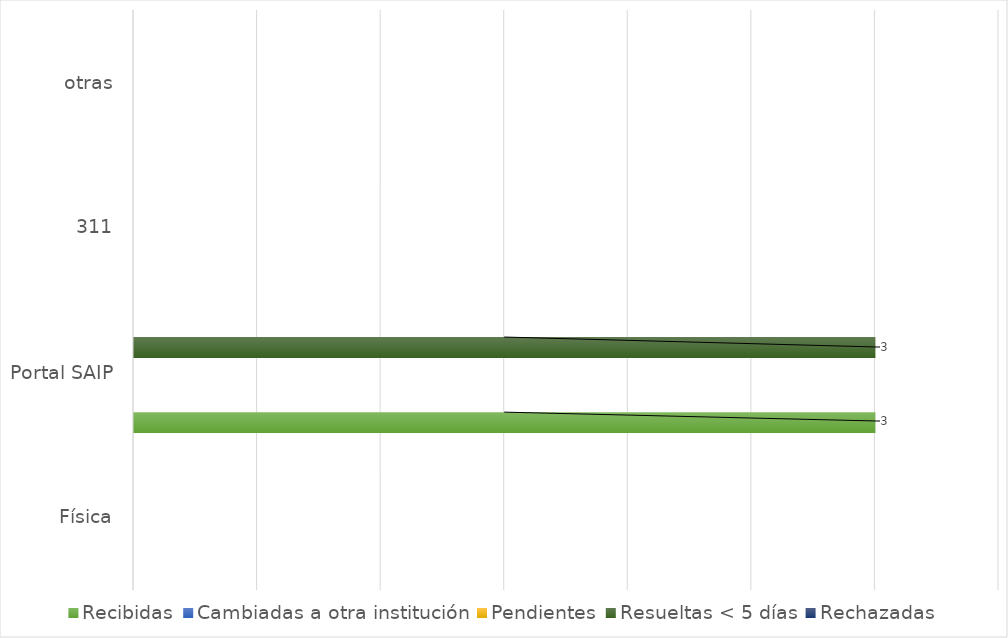
| Category | Recibidas | Cambiadas a otra institución | Pendientes | Resueltas < 5 días | Rechazadas |
|---|---|---|---|---|---|
| Física | 0 | 0 | 0 | 0 | 0 |
| Portal SAIP | 3 | 0 | 0 | 3 | 0 |
| 311 | 0 | 0 | 0 | 0 | 0 |
| otras | 0 | 0 | 0 | 0 | 0 |